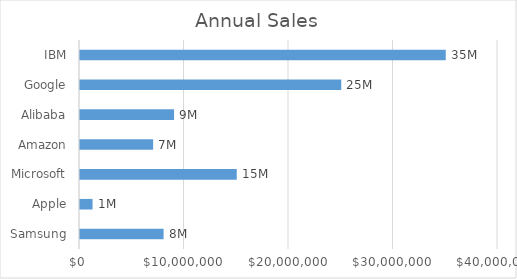
| Category | Annual Sales |
|---|---|
| Samsung | 8000000 |
| Apple | 1200000 |
| Microsoft | 15000000 |
| Amazon | 7000000 |
| Alibaba | 9000000 |
| Google | 25000000 |
| IBM | 35000000 |